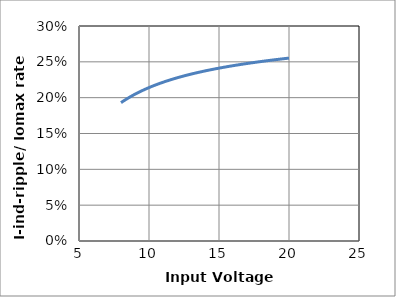
| Category | I-ind-ripple/ Iomax % |
|---|---|
| 8.0 | 0.193 |
| 8.1 | 0.194 |
| 8.2 | 0.196 |
| 8.299999999999999 | 0.197 |
| 8.399999999999999 | 0.198 |
| 8.499999999999998 | 0.199 |
| 8.599999999999998 | 0.2 |
| 8.699999999999998 | 0.202 |
| 8.799999999999997 | 0.203 |
| 8.899999999999997 | 0.204 |
| 8.999999999999996 | 0.205 |
| 9.549999999999997 | 0.21 |
| 10.099999999999998 | 0.215 |
| 10.649999999999999 | 0.219 |
| 11.2 | 0.223 |
| 11.75 | 0.226 |
| 12.3 | 0.229 |
| 12.850000000000001 | 0.232 |
| 13.400000000000002 | 0.235 |
| 13.950000000000003 | 0.237 |
| 14.500000000000004 | 0.239 |
| 15.050000000000004 | 0.241 |
| 15.600000000000005 | 0.243 |
| 16.150000000000006 | 0.245 |
| 16.700000000000006 | 0.247 |
| 17.250000000000007 | 0.248 |
| 17.800000000000008 | 0.25 |
| 18.35000000000001 | 0.251 |
| 18.90000000000001 | 0.253 |
| 19.45000000000001 | 0.254 |
| 20.0 | 0.255 |